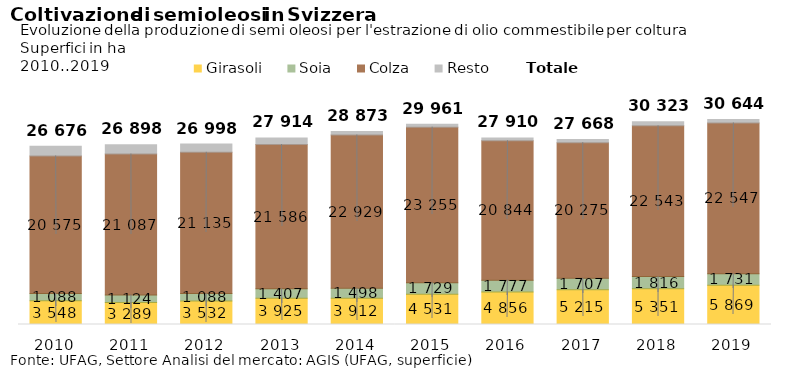
| Category | Girasoli | Soia | Colza | Resto |
|---|---|---|---|---|
| 2010.0 | 3547.8 | 1087.75 | 20574.83 | 1465.97 |
| 2011.0 | 3288.735 | 1123.836 | 21086.998 | 1398.74 |
| 2012.0 | 3532.042 | 1087.699 | 21134.975 | 1242.94 |
| 2013.0 | 3925.142 | 1406.529 | 21585.793 | 996.232 |
| 2014.0 | 3912.11 | 1497.972 | 22929.452 | 533.537 |
| 2015.0 | 4530.755 | 1729.438 | 23254.949 | 446.285 |
| 2016.0 | 4855.719 | 1777.426 | 20843.852 | 433.454 |
| 2017.0 | 5215.486 | 1706.667 | 20274.588 | 471.016 |
| 2018.0 | 5351.436 | 1816.024 | 22542.924 | 613.057 |
| 2019.0 | 5869.287 | 1731.434 | 22546.555 | 496.757 |